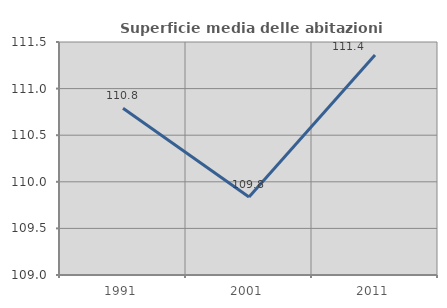
| Category | Superficie media delle abitazioni occupate |
|---|---|
| 1991.0 | 110.79 |
| 2001.0 | 109.837 |
| 2011.0 | 111.361 |